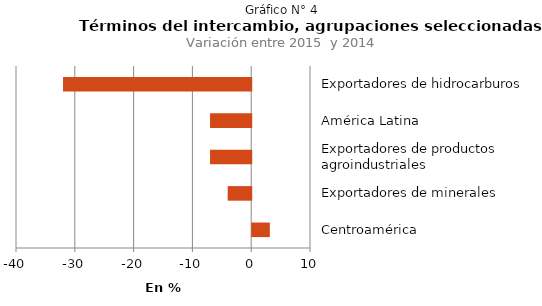
| Category | Series 0 |
|---|---|
| Centroamérica | 3 |
| Exportadores de minerales | -4 |
| Exportadores de productos agroindustriales | -7 |
| América Latina | -7 |
| Exportadores de hidrocarburos | -32 |